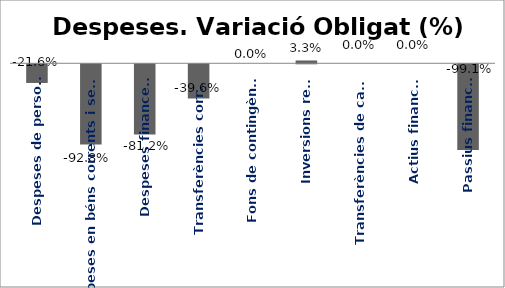
| Category | Series 0 |
|---|---|
| Despeses de personal | -0.216 |
| Despeses en béns corrents i serveis | -0.928 |
| Despeses financeres | -0.812 |
| Transferències corrents | -0.396 |
| Fons de contingència | 0 |
| Inversions reals | 0.032 |
| Transferències de capital | 0 |
| Actius financers | 0 |
| Passius financers | -0.991 |